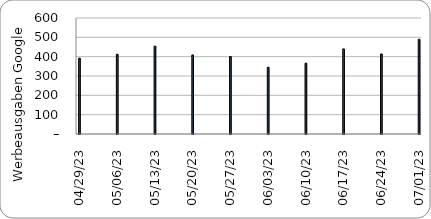
| Category | Google Ad Spend |
|---|---|
| 2023-07-01 | 489.718 |
| 2023-06-24 | 414.007 |
| 2023-06-17 | 440.076 |
| 2023-06-10 | 366.396 |
| 2023-06-03 | 345.417 |
| 2023-05-27 | 400.782 |
| 2023-05-20 | 409.013 |
| 2023-05-13 | 454.182 |
| 2023-05-06 | 412.558 |
| 2023-04-29 | 391.978 |